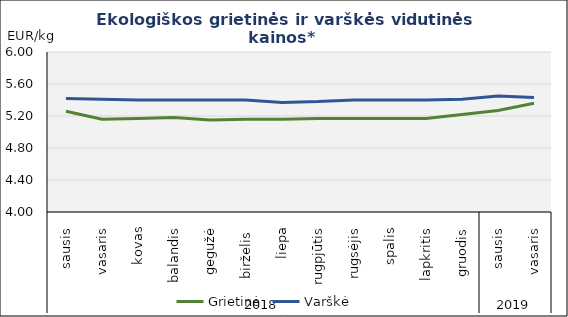
| Category | Grietinė | Varškė |
|---|---|---|
| 0 | 5.26 | 5.42 |
| 1 | 5.16 | 5.41 |
| 2 | 5.17 | 5.4 |
| 3 | 5.18 | 5.4 |
| 4 | 5.15 | 5.4 |
| 5 | 5.16 | 5.4 |
| 6 | 5.16 | 5.37 |
| 7 | 5.17 | 5.38 |
| 8 | 5.17 | 5.4 |
| 9 | 5.17 | 5.4 |
| 10 | 5.17 | 5.4 |
| 11 | 5.22 | 5.41 |
| 12 | 5.27 | 5.45 |
| 13 | 5.36 | 5.43 |